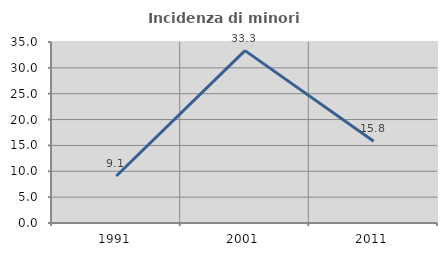
| Category | Incidenza di minori stranieri |
|---|---|
| 1991.0 | 9.091 |
| 2001.0 | 33.333 |
| 2011.0 | 15.789 |